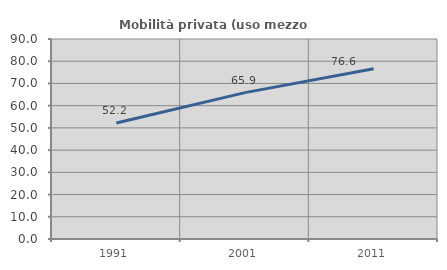
| Category | Mobilità privata (uso mezzo privato) |
|---|---|
| 1991.0 | 52.171 |
| 2001.0 | 65.879 |
| 2011.0 | 76.603 |